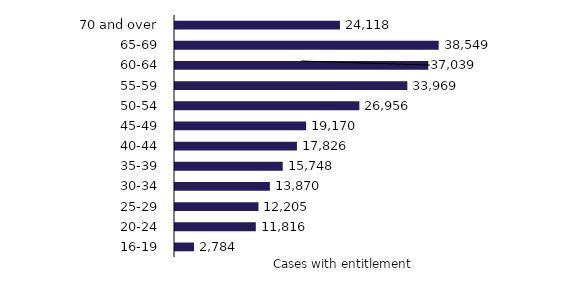
| Category | Series 0 |
|---|---|
| 16-19 | 2784 |
| 20-24 | 11816 |
| 25-29 | 12205 |
| 30-34 | 13870 |
| 35-39 | 15748 |
| 40-44 | 17826 |
| 45-49 | 19170 |
| 50-54 | 26956 |
| 55-59 | 33969 |
| 60-64 | 37039 |
| 65-69 | 38549 |
| 70 and over | 24118 |